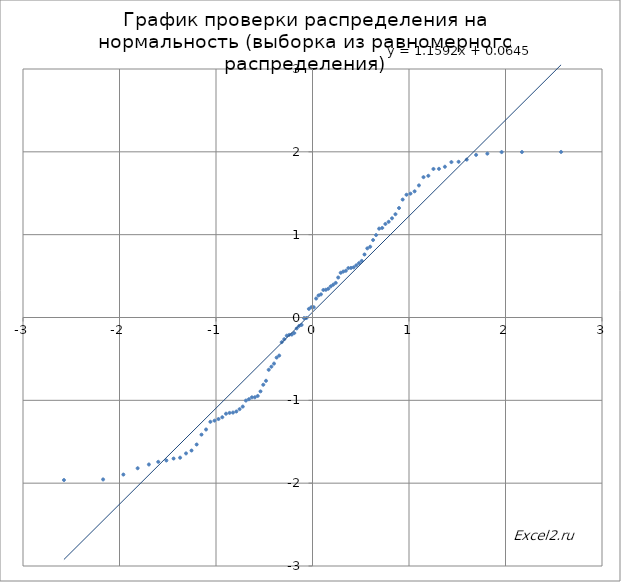
| Category | Равномерное (сортированный список) |
|---|---|
| -2.5758293035489 | -1.962 |
| -2.17009037758456 | -1.955 |
| -1.9599639845400538 | -1.896 |
| -1.8119106729525978 | -1.82 |
| -1.6953977102721358 | -1.774 |
| -1.5981931399228173 | -1.743 |
| -1.5141018876192833 | -1.726 |
| -1.4395314709384572 | -1.703 |
| -1.3722038089987272 | -1.692 |
| -1.3105791121681303 | -1.641 |
| -1.253565438470451 | -1.606 |
| -1.2003588580308597 | -1.533 |
| -1.1503493803760083 | -1.414 |
| -1.1030625561995977 | -1.352 |
| -1.058121617684777 | -1.259 |
| -1.01522203321703 | -1.245 |
| -0.9741138770593097 | -1.226 |
| -0.9345892910734794 | -1.204 |
| -0.8964733640019161 | -1.161 |
| -0.859617364241913 | -1.152 |
| -0.8238936303385577 | -1.148 |
| -0.7891916526582219 | -1.135 |
| -0.7554150263604691 | -1.106 |
| -0.7224790519280626 | -1.075 |
| -0.6903088239330339 | -1.003 |
| -0.6588376927361878 | -0.986 |
| -0.6280060144375699 | -0.964 |
| -0.5977601260424784 | -0.963 |
| -0.5680514983389828 | -0.947 |
| -0.5388360302784504 | -0.892 |
| -0.5100734569685949 | -0.812 |
| -0.48172684958473044 | -0.764 |
| -0.4537621901698795 | -0.631 |
| -0.4261480078412782 | -0.594 |
| -0.3988550656423369 | -0.556 |
| -0.3718560893850747 | -0.484 |
| -0.3451255314704724 | -0.46 |
| -0.3186393639643752 | -0.298 |
| -0.2923748962268042 | -0.262 |
| -0.266310613204095 | -0.219 |
| -0.2404260311423079 | -0.21 |
| -0.21470156800174456 | -0.206 |
| -0.18911842627279254 | -0.188 |
| -0.16365848623314128 | -0.132 |
| -0.1383042079614045 | -0.102 |
| -0.11303854064456513 | -0.09 |
| -0.08784483789587168 | -0.007 |
| -0.06270677794321385 | -0.006 |
| -0.037608287661255936 | 0.104 |
| -0.012533469508069276 | 0.124 |
| 0.012533469508069276 | 0.124 |
| 0.037608287661255936 | 0.229 |
| 0.06270677794321385 | 0.266 |
| 0.08784483789587182 | 0.279 |
| 0.11303854064456527 | 0.332 |
| 0.13830420796140466 | 0.335 |
| 0.16365848623314114 | 0.347 |
| 0.18911842627279243 | 0.376 |
| 0.2147015680017444 | 0.396 |
| 0.2404260311423079 | 0.418 |
| 0.266310613204095 | 0.483 |
| 0.2923748962268042 | 0.54 |
| 0.3186393639643752 | 0.554 |
| 0.3451255314704724 | 0.564 |
| 0.3718560893850747 | 0.597 |
| 0.3988550656423369 | 0.599 |
| 0.4261480078412784 | 0.606 |
| 0.4537621901698797 | 0.63 |
| 0.48172684958473044 | 0.656 |
| 0.5100734569685947 | 0.683 |
| 0.5388360302784501 | 0.761 |
| 0.5680514983389827 | 0.835 |
| 0.5977601260424784 | 0.854 |
| 0.6280060144375699 | 0.935 |
| 0.6588376927361878 | 0.995 |
| 0.6903088239330339 | 1.073 |
| 0.7224790519280626 | 1.081 |
| 0.7554150263604691 | 1.129 |
| 0.7891916526582219 | 1.155 |
| 0.8238936303385577 | 1.198 |
| 0.8596173642419115 | 1.247 |
| 0.8964733640019159 | 1.322 |
| 0.9345892910734801 | 1.424 |
| 0.9741138770593097 | 1.482 |
| 1.01522203321703 | 1.495 |
| 1.058121617684777 | 1.523 |
| 1.1030625561995977 | 1.595 |
| 1.1503493803760083 | 1.694 |
| 1.2003588580308597 | 1.711 |
| 1.253565438470451 | 1.793 |
| 1.3105791121681303 | 1.795 |
| 1.3722038089987258 | 1.82 |
| 1.4395314709384563 | 1.876 |
| 1.5141018876192844 | 1.88 |
| 1.5981931399228169 | 1.906 |
| 1.6953977102721358 | 1.963 |
| 1.8119106729525971 | 1.978 |
| 1.9599639845400536 | 1.997 |
| 2.17009037758456 | 1.998 |
| 2.5758293035489 | 1.999 |